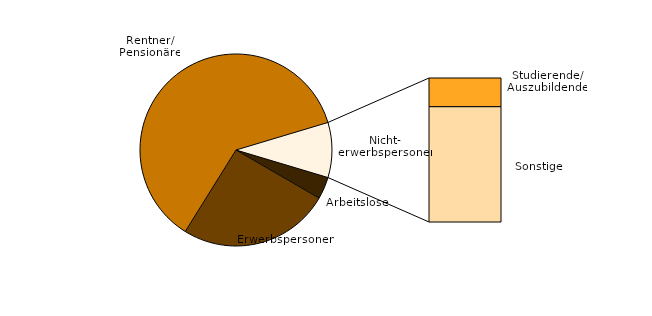
| Category | Anzahl |
|---|---|
| Arbeitslose | 815 |
| Erwerbstätige | 5595 |
| Rentner und Pensionäre | 13485 |
| Studenten / Auszubildende | 405 |
| Sonstige | 1625 |